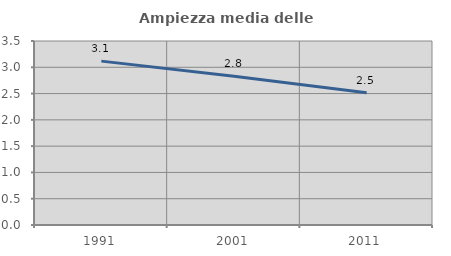
| Category | Ampiezza media delle famiglie |
|---|---|
| 1991.0 | 3.117 |
| 2001.0 | 2.828 |
| 2011.0 | 2.517 |